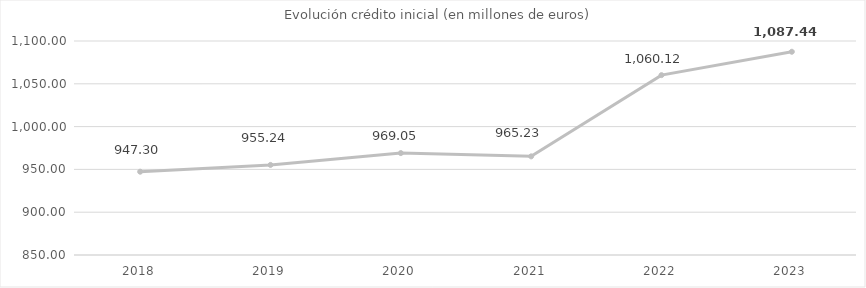
| Category | Presupuesto inicial (en millones de euros) |
|---|---|
| 2018.0 | 947.3 |
| 2019.0 | 955.238 |
| 2020.0 | 969.045 |
| 2021.0 | 965.234 |
| 2022.0 | 1060.12 |
| 2023.0 | 1087.435 |